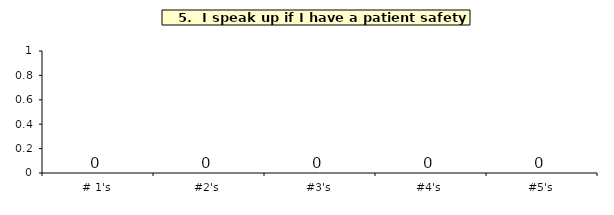
| Category | Q_5 |
|---|---|
| # 1's | 0 |
| #2's | 0 |
| #3's | 0 |
| #4's | 0 |
| #5's | 0 |